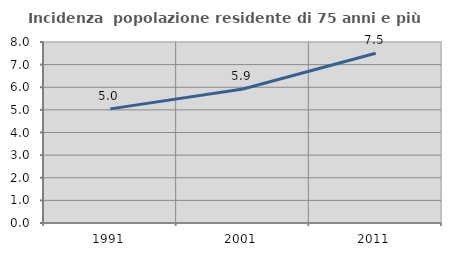
| Category | Incidenza  popolazione residente di 75 anni e più |
|---|---|
| 1991.0 | 5.044 |
| 2001.0 | 5.925 |
| 2011.0 | 7.502 |